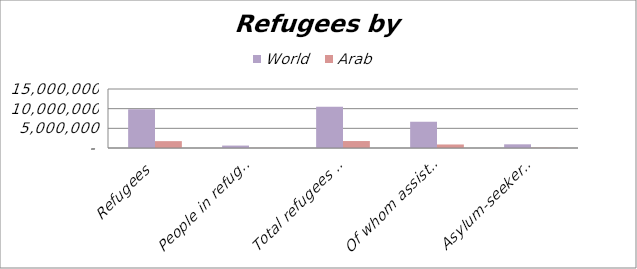
| Category | World  | Arab  |
|---|---|---|
| Refugees | 9881538 | 1743439 |
| People in refugee-like situations | 618703 | 26462 |
| Total refugees and people in refugee-like situations | 10500241 | 1769901 |
| Of whom assisted by UNHCR | 6674950 | 896692 |
| Asylum-seekers (pending cases) | 936740 | 72212 |